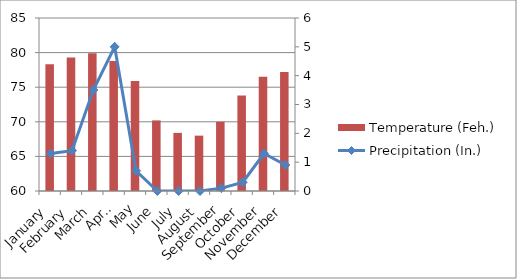
| Category | Temperature (Feh.) |
|---|---|
| January | 78.3 |
| February | 79.3 |
| March | 79.9 |
| April | 78.8 |
| May | 75.9 |
| June | 70.2 |
| July | 68.4 |
| August | 68 |
| September | 70 |
| October | 73.8 |
| November | 76.5 |
| December | 77.2 |